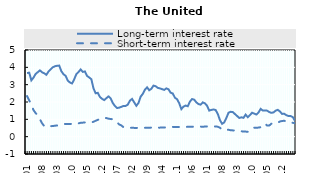
| Category | Long-term interest rate | Short-term interest rate |
|---|---|---|
| 2009-01 | 3.67 | 2.343 |
| 2009-02 | 3.69 | 2.09 |
| 2009-03 | 3.25 | 1.831 |
| 2009-04 | 3.407 | 1.534 |
| 2009-05 | 3.621 | 1.358 |
| 2009-06 | 3.722 | 1.241 |
| 2009-07 | 3.824 | 1.001 |
| 2009-08 | 3.714 | 0.774 |
| 2009-09 | 3.657 | 0.606 |
| 2009-10 | 3.57 | 0.571 |
| 2009-11 | 3.759 | 0.609 |
| 2009-12 | 3.887 | 0.605 |
| 2010-01 | 4.003 | 0.613 |
| 2010-02 | 4.062 | 0.633 |
| 2010-03 | 4.092 | 0.645 |
| 2010-04 | 4.101 | 0.656 |
| 2010-05 | 3.777 | 0.697 |
| 2010-06 | 3.601 | 0.728 |
| 2010-07 | 3.509 | 0.736 |
| 2010-08 | 3.233 | 0.733 |
| 2010-09 | 3.127 | 0.729 |
| 2010-10 | 3.068 | 0.738 |
| 2010-11 | 3.311 | 0.739 |
| 2010-12 | 3.61 | 0.75 |
| 2011-01 | 3.727 | 0.769 |
| 2011-02 | 3.88 | 0.8 |
| 2011-03 | 3.739 | 0.809 |
| 2011-04 | 3.762 | 0.821 |
| 2011-05 | 3.505 | 0.823 |
| 2011-06 | 3.414 | 0.825 |
| 2011-07 | 3.314 | 0.829 |
| 2011-08 | 2.783 | 0.858 |
| 2011-09 | 2.504 | 0.918 |
| 2011-10 | 2.529 | 0.97 |
| 2011-11 | 2.292 | 1.012 |
| 2011-12 | 2.183 | 1.061 |
| 2012-01 | 2.11 | 1.087 |
| 2012-02 | 2.219 | 1.072 |
| 2012-03 | 2.323 | 1.038 |
| 2012-04 | 2.212 | 1.018 |
| 2012-05 | 1.942 | 1.005 |
| 2012-06 | 1.77 | 0.95 |
| 2012-07 | 1.652 | 0.817 |
| 2012-08 | 1.674 | 0.705 |
| 2012-09 | 1.722 | 0.648 |
| 2012-10 | 1.772 | 0.544 |
| 2012-11 | 1.774 | 0.525 |
| 2012-12 | 1.847 | 0.518 |
| 2013-01 | 2.08 | 0.512 |
| 2013-02 | 2.178 | 0.51 |
| 2013-03 | 1.977 | 0.507 |
| 2013-04 | 1.782 | 0.506 |
| 2013-05 | 1.946 | 0.506 |
| 2013-06 | 2.306 | 0.508 |
| 2013-07 | 2.471 | 0.509 |
| 2013-08 | 2.709 | 0.513 |
| 2013-09 | 2.844 | 0.517 |
| 2013-10 | 2.678 | 0.517 |
| 2013-11 | 2.76 | 0.523 |
| 2013-12 | 2.946 | 0.525 |
| 2014-01 | 2.91 | 0.521 |
| 2014-02 | 2.815 | 0.522 |
| 2014-03 | 2.784 | 0.522 |
| 2014-04 | 2.742 | 0.527 |
| 2014-05 | 2.699 | 0.527 |
| 2014-06 | 2.784 | 0.544 |
| 2014-07 | 2.734 | 0.556 |
| 2014-08 | 2.535 | 0.561 |
| 2014-09 | 2.492 | 0.563 |
| 2014-10 | 2.247 | 0.558 |
| 2014-11 | 2.159 | 0.556 |
| 2014-12 | 1.929 | 0.558 |
| 2015-01 | 1.589 | 0.563 |
| 2015-02 | 1.736 | 0.564 |
| 2015-03 | 1.794 | 0.564 |
| 2015-04 | 1.755 | 0.57 |
| 2015-05 | 2.024 | 0.568 |
| 2015-06 | 2.17 | 0.572 |
| 2015-07 | 2.135 | 0.581 |
| 2015-08 | 1.98 | 0.587 |
| 2015-09 | 1.881 | 0.586 |
| 2015-10 | 1.846 | 0.58 |
| 2015-11 | 1.978 | 0.574 |
| 2015-12 | 1.923 | 0.583 |
| 2016-01 | 1.783 | 0.59 |
| 2016-02 | 1.503 | 0.591 |
| 2016-03 | 1.543 | 0.588 |
| 2016-04 | 1.569 | 0.589 |
| 2016-05 | 1.537 | 0.589 |
| 2016-06 | 1.31 | 0.575 |
| 2016-07 | 0.957 | 0.514 |
| 2016-08 | 0.742 | 0.406 |
| 2016-09 | 0.824 | 0.379 |
| 2016-10 | 1.078 | 0.398 |
| 2016-11 | 1.382 | 0.398 |
| 2016-12 | 1.434 | 0.372 |
| 2017-01 | 1.42 | 0.362 |
| 2017-02 | 1.306 | 0.357 |
| 2017-03 | 1.194 | 0.346 |
| 2017-04 | 1.079 | 0.335 |
| 2017-05 | 1.118 | 0.311 |
| 2017-06 | 1.085 | 0.294 |
| 2017-07 | 1.271 | 0.293 |
| 2017-08 | 1.124 | 0.281 |
| 2017-09 | 1.244 | 0.309 |
| 2017-10 | 1.382 | 0.382 |
| 2017-11 | 1.33 | 0.519 |
| 2017-12 | 1.278 | 0.519 |
| 2018-01 | 1.393 | 0.522 |
| 2018-02 | 1.603 | 0.547 |
| 2018-03 | 1.508 | 0.628 |
| 2018-04 | 1.511 | 0.756 |
| 2018-05 | 1.502 | 0.644 |
| 2018-06 | 1.423 | 0.639 |
| 2018-07 | 1.374 | 0.746 |
| 2018-08 | 1.399 | 0.805 |
| 2018-09 | 1.502 | 0.801 |
| 2018-10 | 1.546 | 0.806 |
| 2018-11 | 1.454 | 0.875 |
| 2018-12 | 1.312 | 0.904 |
| 2019-01 | 1.322 | 0.918 |
| 2019-02 | 1.239 | 0.876 |
| 2019-03 | 1.19 | 0.84 |
| 2019-04 | 1.191 | 0.82 |
| 2019-05 | 1.13 | 0.8 |
| 2019-06 | 0.919 | 0.78 |